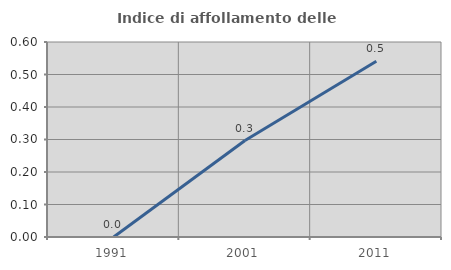
| Category | Indice di affollamento delle abitazioni  |
|---|---|
| 1991.0 | 0 |
| 2001.0 | 0.297 |
| 2011.0 | 0.541 |